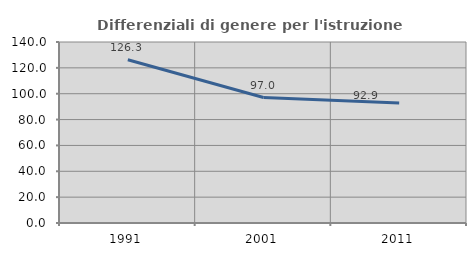
| Category | Differenziali di genere per l'istruzione superiore |
|---|---|
| 1991.0 | 126.32 |
| 2001.0 | 97.043 |
| 2011.0 | 92.871 |